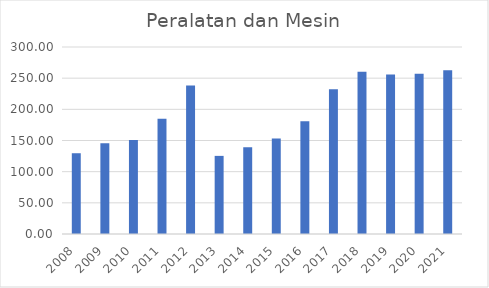
| Category | Peralatan dan Mesin |
|---|---|
| 2008.0 | 129.575 |
| 2009.0 | 145.767 |
| 2010.0 | 150.869 |
| 2011.0 | 184.852 |
| 2012.0 | 238.129 |
| 2013.0 | 125.328 |
| 2014.0 | 139.173 |
| 2015.0 | 153.399 |
| 2016.0 | 180.717 |
| 2017.0 | 232.316 |
| 2018.0 | 260.264 |
| 2019.0 | 255.825 |
| 2020.0 | 257.25 |
| 2021.0 | 262.837 |